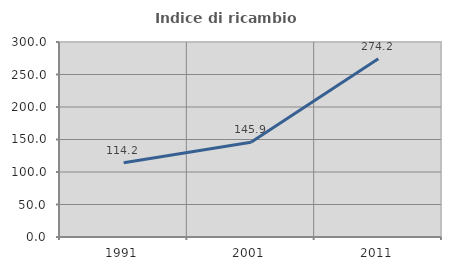
| Category | Indice di ricambio occupazionale  |
|---|---|
| 1991.0 | 114.194 |
| 2001.0 | 145.855 |
| 2011.0 | 274.172 |